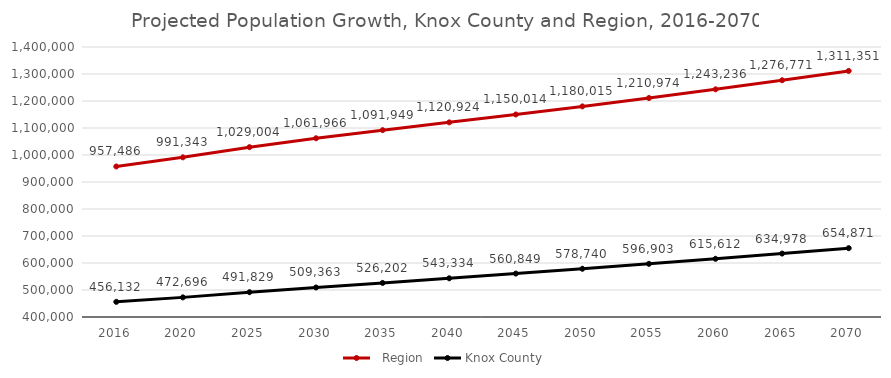
| Category |   Region | Knox County |
|---|---|---|
| 2016.0 | 957486 | 456132 |
| 2020.0 | 991343.299 | 472696.099 |
| 2025.0 | 1029003.599 | 491829.099 |
| 2030.0 | 1061966.099 | 509363.399 |
| 2035.0 | 1091949.4 | 526201.8 |
| 2040.0 | 1120924 | 543334.499 |
| 2045.0 | 1150013.798 | 560848.8 |
| 2050.0 | 1180015.402 | 578740.301 |
| 2055.0 | 1210973.901 | 596902.6 |
| 2060.0 | 1243235.801 | 615612.4 |
| 2065.0 | 1276770.801 | 634978.301 |
| 2070.0 | 1311351.001 | 654870.6 |